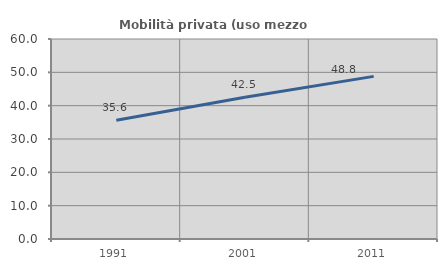
| Category | Mobilità privata (uso mezzo privato) |
|---|---|
| 1991.0 | 35.615 |
| 2001.0 | 42.511 |
| 2011.0 | 48.786 |